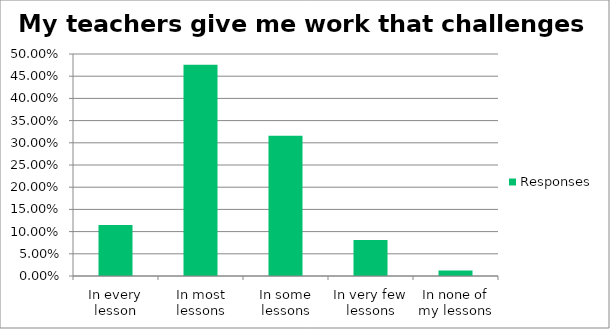
| Category | Responses |
|---|---|
| In every lesson | 0.115 |
| In most lessons | 0.476 |
| In some lessons | 0.316 |
| In very few lessons | 0.081 |
| In none of my lessons | 0.013 |